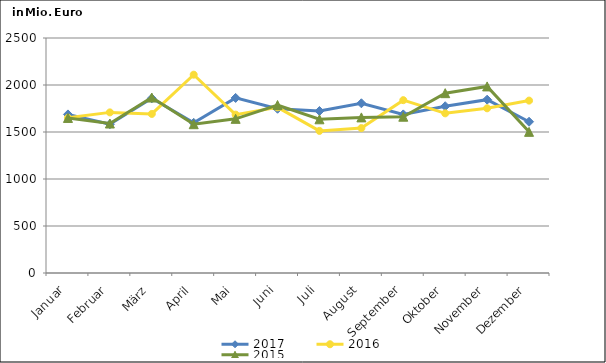
| Category | 2017 | 2016 | 2015 |
|---|---|---|---|
| Januar | 1687.048 | 1650.879 | 1649.554 |
| Februar | 1582.678 | 1708.645 | 1590.268 |
| März | 1858.326 | 1692.271 | 1866.664 |
| April | 1597.556 | 2109.648 | 1582.798 |
| Mai | 1862.56 | 1684.742 | 1639.924 |
| Juni | 1747.243 | 1761.976 | 1786.893 |
| Juli | 1723.336 | 1511.726 | 1635.183 |
| August | 1805.426 | 1541.385 | 1655.404 |
| September | 1687.333 | 1838.624 | 1662.606 |
| Oktober | 1773.986 | 1698.524 | 1913.109 |
| November | 1843.798 | 1752.059 | 1984.938 |
| Dezember | 1609.054 | 1834.063 | 1501.624 |